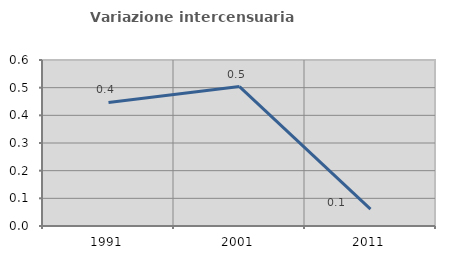
| Category | Variazione intercensuaria annua |
|---|---|
| 1991.0 | 0.447 |
| 2001.0 | 0.504 |
| 2011.0 | 0.061 |